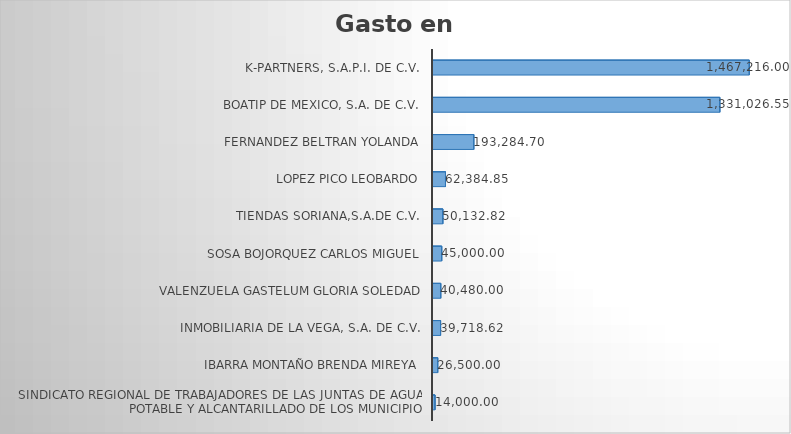
| Category | Suma |
|---|---|
| SINDICATO REGIONAL DE TRABAJADORES DE LAS JUNTAS DE AGUA POTABLE Y ALCANTARILLADO DE LOS MUNICIPIO | 14000 |
| IBARRA MONTAÑO BRENDA MIREYA | 26500 |
| INMOBILIARIA DE LA VEGA, S.A. DE C.V. | 39718.62 |
| VALENZUELA GASTELUM GLORIA SOLEDAD | 40480 |
| SOSA BOJORQUEZ CARLOS MIGUEL | 45000 |
| TIENDAS SORIANA,S.A.DE C.V. | 50132.82 |
| LOPEZ PICO LEOBARDO | 62384.85 |
| FERNANDEZ BELTRAN YOLANDA | 193284.7 |
| BOATIP DE MEXICO, S.A. DE C.V. | 1331026.55 |
| K-PARTNERS, S.A.P.I. DE C.V. | 1467216 |